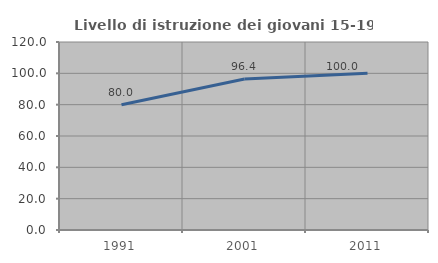
| Category | Livello di istruzione dei giovani 15-19 anni |
|---|---|
| 1991.0 | 80 |
| 2001.0 | 96.429 |
| 2011.0 | 100 |